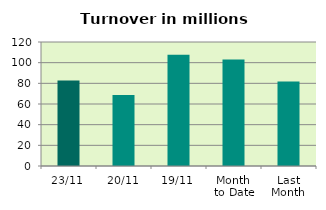
| Category | Series 0 |
|---|---|
| 23/11 | 82.75 |
| 20/11 | 68.605 |
| 19/11 | 107.708 |
| Month 
to Date | 103.152 |
| Last
Month | 81.795 |